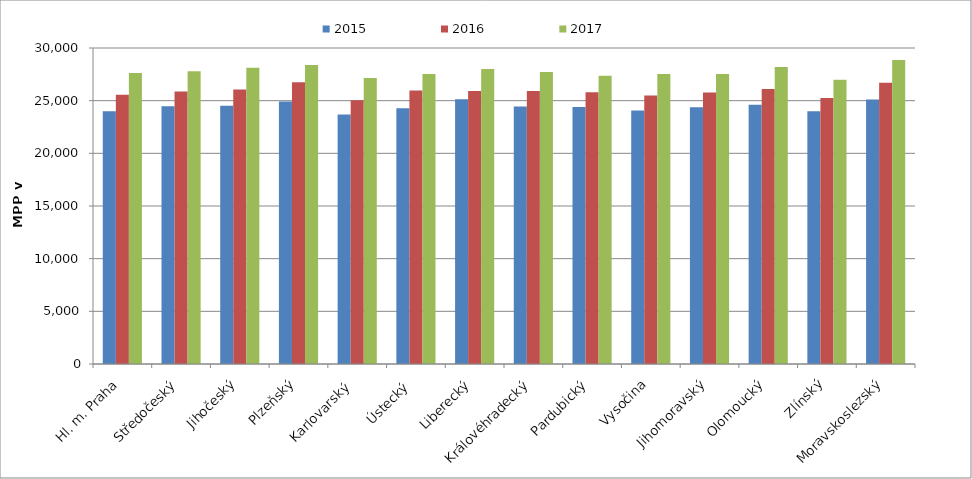
| Category | 2015 | 2016 | 2017 |
|---|---|---|---|
| Hl. m. Praha | 24001.305 | 25571.13 | 27617.577 |
| Středočeský | 24479.358 | 25863.365 | 27798.713 |
| Jihočeský | 24517.51 | 26057.371 | 28120.871 |
| Plzeňský | 24929.644 | 26745.6 | 28385.849 |
| Karlovarský  | 23683.702 | 25037.056 | 27163.756 |
| Ústecký   | 24270.626 | 25968.539 | 27526.806 |
| Liberecký | 25127.18 | 25920.772 | 27995.183 |
| Královéhradecký | 24445.609 | 25912.789 | 27716.487 |
| Pardubický | 24391.024 | 25806.353 | 27361.114 |
| Vysočina | 24076.433 | 25493.669 | 27533.42 |
| Jihomoravský | 24375.523 | 25772.579 | 27526.569 |
| Olomoucký | 24623.739 | 26101.164 | 28189.294 |
| Zlínský | 23987.752 | 25249.746 | 26979.803 |
| Moravskoslezský | 25116.322 | 26711.598 | 28854.091 |